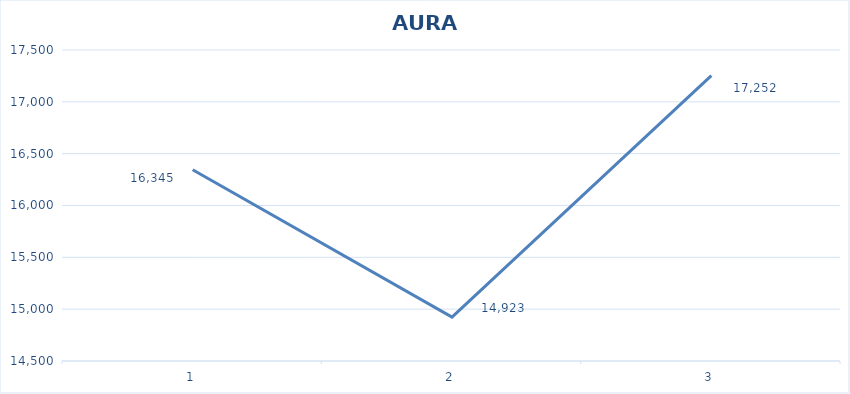
| Category | AURA TOTAL |
|---|---|
| 0 | 16345 |
| 1 | 14923 |
| 2 | 17252 |